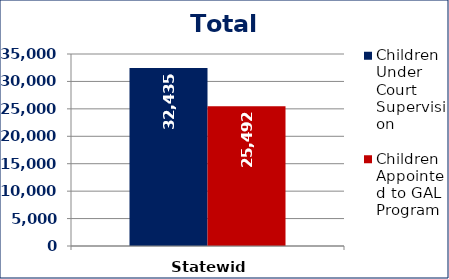
| Category | Children Under Court Supervision  | Children Appointed to GAL Program  |
|---|---|---|
| Statewide | 32435 | 25492 |